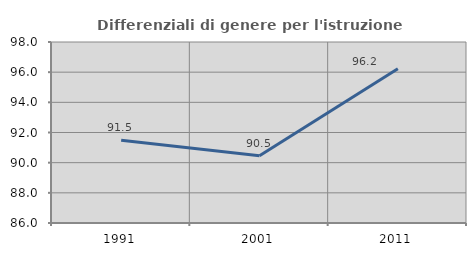
| Category | Differenziali di genere per l'istruzione superiore |
|---|---|
| 1991.0 | 91.479 |
| 2001.0 | 90.457 |
| 2011.0 | 96.223 |